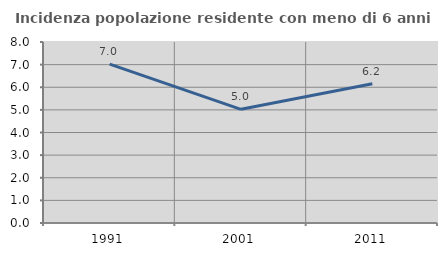
| Category | Incidenza popolazione residente con meno di 6 anni |
|---|---|
| 1991.0 | 7.024 |
| 2001.0 | 5.023 |
| 2011.0 | 6.151 |